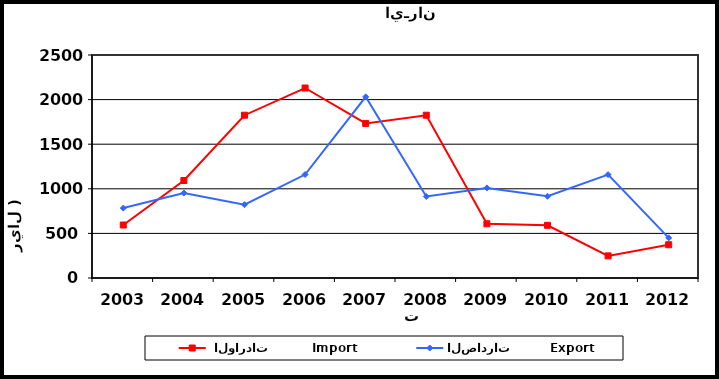
| Category |  الواردات           Import | الصادرات          Export |
|---|---|---|
| 2003.0 | 594 | 784 |
| 2004.0 | 1093 | 953 |
| 2005.0 | 1825 | 822 |
| 2006.0 | 2130 | 1160 |
| 2007.0 | 1733 | 2031 |
| 2008.0 | 1825 | 914 |
| 2009.0 | 608 | 1010 |
| 2010.0 | 591 | 916 |
| 2011.0 | 248 | 1159 |
| 2012.0 | 373 | 450 |